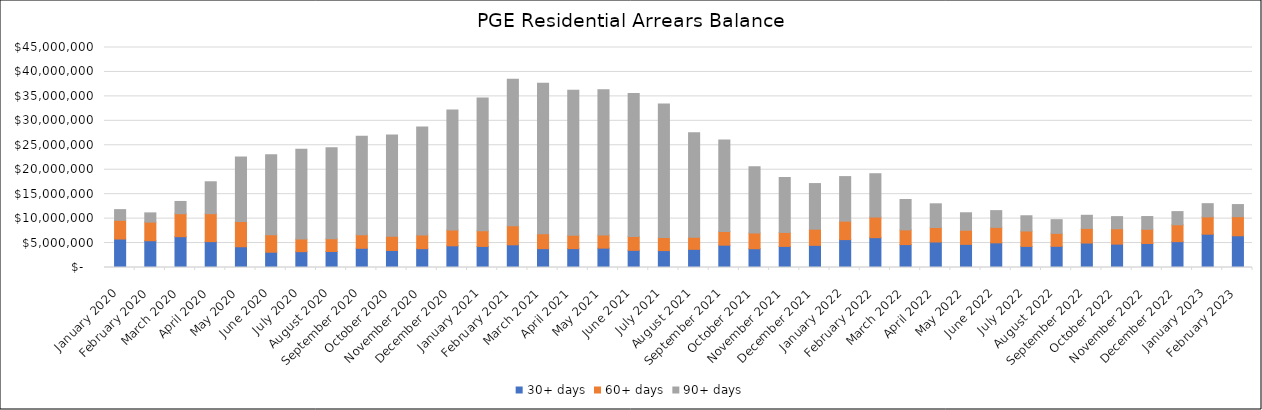
| Category | 30+ days | 60+ days | 90+ days |
|---|---|---|---|
| 2020-01-01 | 5817118.82 | 3831179.8 | 2190658.55 |
| 2020-02-01 | 5475936.52 | 3809838.33 | 1887442.35 |
| 2020-03-01 | 6301409.19 | 4701837.11 | 2505227 |
| 2020-04-01 | 5289594.8 | 5721816.99 | 6525456.72 |
| 2020-05-01 | 4240861.92 | 5185322.78 | 13166529.58 |
| 2020-06-01 | 3124857.61 | 3592694.07 | 16355175.6 |
| 2020-07-01 | 3239709.47 | 2593685.57 | 18332091.23 |
| 2020-08-01 | 3268774.61 | 2634793.71 | 18567942.07 |
| 2020-09-01 | 3928063.06 | 2793681.96 | 20100842.17 |
| 2020-10-01 | 3486701.01 | 2886857.46 | 20721526.53 |
| 2020-11-01 | 3851204.41 | 2808617.23 | 22087379.86 |
| 2020-12-01 | 4436798 | 3242752 | 24529487 |
| 2021-01-01 | 4313280 | 3226964 | 27141111 |
| 2021-02-01 | 4642548 | 3904261 | 29965089 |
| 2021-03-01 | 3857505.17 | 3024401.89 | 30795650.78 |
| 2021-04-01 | 3860739.71 | 2734286.21 | 29680063.72 |
| 2021-05-01 | 3959215.38 | 2690413.8 | 29728327.73 |
| 2021-06-01 | 3508491.94 | 2829084.59 | 29274822.67 |
| 2021-07-01 | 3460643.42 | 2664418.87 | 27342507.79 |
| 2021-08-01 | 3714327.99 | 2479337.31 | 21387806.97 |
| 2021-09-01 | 4562723.13 | 2791883.07 | 18700618.63 |
| 2021-10-01 | 3838711.88 | 3211095.12 | 13569756.59 |
| 2021-11-01 | 4312954.54 | 2859576.09 | 11234711.92 |
| 2021-12-01 | 4528630.42 | 3303766.48 | 9335662.45 |
| 2022-01-01 | 5701919.76 | 3775849.71 | 9117381.89 |
| 2022-02-01 | 6096347.7 | 4224471.79 | 8860087.19 |
| 2022-03-01 | 4688417 | 3012255 | 6206469 |
| 2022-04-01 | 5216062.19 | 2962011.5 | 4851121.69 |
| 2022-05-01 | 4729683.3 | 2900565.11 | 3564579.1 |
| 2022-06-01 | 5041672.4 | 3166985.5 | 3425632.9 |
| 2022-07-01 | 4319564.84 | 3142895.9 | 3120915.75 |
| 2022-08-01 | 4335150.84 | 2643075.67 | 2807307.15 |
| 2022-09-01 | 4999069.46 | 2990136.79 | 2692050.87 |
| 2022-10-01 | 4781535.43 | 3143722.58 | 2483952.88 |
| 2022-11-01 | 4911622.02 | 2895966.12 | 2617150.6 |
| 2022-12-01 | 5288664.35 | 3448862.99 | 2694728.27 |
| 2023-01-01 | 6807439.54 | 3552299.95 | 2696288.77 |
| 2023-02-01 | 6486101.64 | 3907273.78 | 2480960.24 |